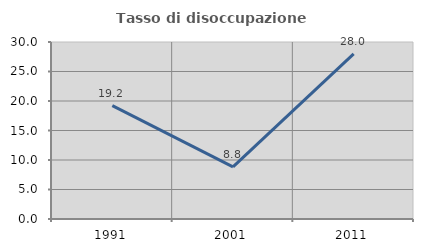
| Category | Tasso di disoccupazione giovanile  |
|---|---|
| 1991.0 | 19.231 |
| 2001.0 | 8.824 |
| 2011.0 | 28 |